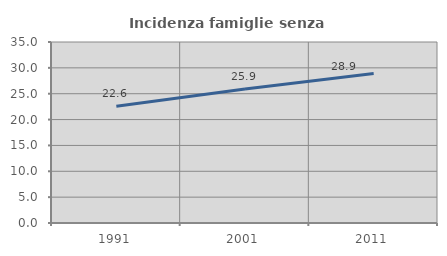
| Category | Incidenza famiglie senza nuclei |
|---|---|
| 1991.0 | 22.597 |
| 2001.0 | 25.93 |
| 2011.0 | 28.903 |